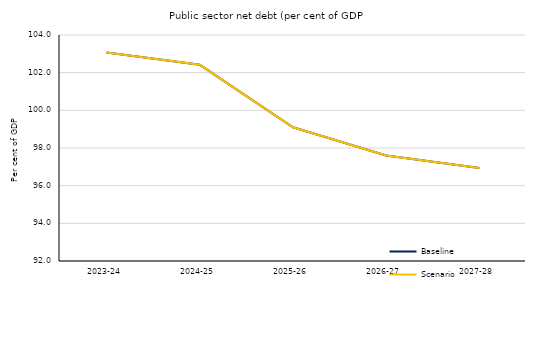
| Category | Baseline | Scenario |
|---|---|---|
| 2023-24 | 103.073 | 103.073 |
| 2024-25 | 102.418 | 102.418 |
| 2025-26 | 99.1 | 99.1 |
| 2026-27 | 97.603 | 97.603 |
| 2027-28 | 96.932 | 96.932 |